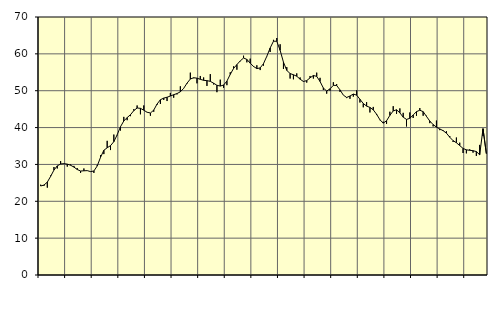
| Category | Piggar | Series 1 |
|---|---|---|
| nan | 24.5 | 24.15 |
| 87.0 | 24.2 | 24.41 |
| 87.0 | 23.7 | 25.2 |
| 87.0 | 27 | 26.77 |
| nan | 29.3 | 28.47 |
| 88.0 | 28.9 | 29.61 |
| 88.0 | 30.9 | 30.12 |
| 88.0 | 30.2 | 30.22 |
| nan | 29.4 | 30.08 |
| 89.0 | 30 | 29.78 |
| 89.0 | 29.6 | 29.28 |
| 89.0 | 29 | 28.62 |
| nan | 27.7 | 28.21 |
| 90.0 | 28.9 | 28.27 |
| 90.0 | 28.3 | 28.32 |
| 90.0 | 28.1 | 28.05 |
| nan | 27.7 | 28.22 |
| 91.0 | 29.8 | 29.57 |
| 91.0 | 32.5 | 31.93 |
| 91.0 | 32.8 | 33.83 |
| nan | 36.4 | 34.52 |
| 92.0 | 33.9 | 35.09 |
| 92.0 | 38.1 | 36.17 |
| 92.0 | 37.9 | 38.03 |
| nan | 39.2 | 40.23 |
| 93.0 | 42.9 | 41.79 |
| 93.0 | 42 | 42.71 |
| 93.0 | 43.1 | 43.48 |
| nan | 45 | 44.59 |
| 94.0 | 46 | 45.31 |
| 94.0 | 43.6 | 45.22 |
| 94.0 | 46 | 44.72 |
| nan | 44.2 | 44.16 |
| 95.0 | 43.2 | 43.96 |
| 95.0 | 44.3 | 44.74 |
| 95.0 | 46.2 | 46.39 |
| nan | 46.4 | 47.55 |
| 96.0 | 47.5 | 48 |
| 96.0 | 47.2 | 48.23 |
| 96.0 | 49.4 | 48.56 |
| nan | 48.1 | 48.92 |
| 97.0 | 49 | 49.23 |
| 97.0 | 51.2 | 49.7 |
| 97.0 | 50.6 | 50.64 |
| nan | 51.9 | 52.04 |
| 98.0 | 54.9 | 53.17 |
| 98.0 | 53.4 | 53.52 |
| 98.0 | 52 | 53.41 |
| nan | 54 | 53.09 |
| 99.0 | 53.6 | 52.82 |
| 99.0 | 51.3 | 52.73 |
| 99.0 | 54.5 | 52.54 |
| nan | 51.7 | 52.04 |
| 0.0 | 49.6 | 51.47 |
| 0.0 | 53 | 51.26 |
| 0.0 | 50.8 | 51.53 |
| nan | 51.5 | 52.61 |
| 1.0 | 55 | 54.43 |
| 1.0 | 56.6 | 56.04 |
| 1.0 | 55.7 | 57.09 |
| nan | 58 | 58.08 |
| 2.0 | 59.5 | 58.87 |
| 2.0 | 57.7 | 58.5 |
| 2.0 | 58.7 | 57.47 |
| nan | 56.7 | 56.59 |
| 3.0 | 56.9 | 56 |
| 3.0 | 55.6 | 56.19 |
| 3.0 | 56.8 | 57.35 |
| nan | 59.4 | 59.34 |
| 4.0 | 60.5 | 61.59 |
| 4.0 | 63.8 | 63.43 |
| 4.0 | 64.3 | 63.42 |
| nan | 62.6 | 60.95 |
| 5.0 | 55.9 | 57.74 |
| 5.0 | 56.4 | 55.51 |
| 5.0 | 53.3 | 54.66 |
| nan | 53.1 | 54.33 |
| 6.0 | 54.7 | 53.93 |
| 6.0 | 53.6 | 53.13 |
| 6.0 | 52.6 | 52.51 |
| nan | 52.2 | 52.74 |
| 7.0 | 54 | 53.5 |
| 7.0 | 53.3 | 54.13 |
| 7.0 | 54.9 | 53.89 |
| nan | 53.5 | 52.51 |
| 8.0 | 50.2 | 50.72 |
| 8.0 | 49.2 | 49.91 |
| 8.0 | 50 | 50.51 |
| nan | 52.3 | 51.46 |
| 9.0 | 51.8 | 51.42 |
| 9.0 | 49.7 | 50.22 |
| 9.0 | 48.8 | 48.81 |
| nan | 48 | 48.17 |
| 10.0 | 47.8 | 48.56 |
| 10.0 | 48.4 | 49.1 |
| 10.0 | 50.1 | 48.8 |
| nan | 46.8 | 47.68 |
| 11.0 | 45.5 | 46.52 |
| 11.0 | 46.9 | 45.83 |
| 11.0 | 44.1 | 45.47 |
| nan | 45.6 | 44.81 |
| 12.0 | 43.4 | 43.62 |
| 12.0 | 42 | 42.13 |
| 12.0 | 41.6 | 41.2 |
| nan | 41 | 41.84 |
| 13.0 | 44.3 | 43.31 |
| 13.0 | 45.8 | 44.52 |
| 13.0 | 43.7 | 44.83 |
| nan | 45.2 | 44 |
| 14.0 | 44 | 42.82 |
| 14.0 | 40.3 | 42.21 |
| 14.0 | 44.1 | 42.51 |
| nan | 42.6 | 43.42 |
| 15.0 | 43.2 | 44.32 |
| 15.0 | 45.3 | 44.71 |
| 15.0 | 43.2 | 44.32 |
| nan | 43.2 | 43.03 |
| 16.0 | 41.2 | 41.77 |
| 16.0 | 40.3 | 40.82 |
| 16.0 | 41.9 | 40.12 |
| nan | 39.3 | 39.63 |
| 17.0 | 39.3 | 39.16 |
| 17.0 | 39 | 38.49 |
| 17.0 | 37.7 | 37.38 |
| nan | 36.1 | 36.45 |
| 18.0 | 37.3 | 35.89 |
| 18.0 | 35.9 | 35.12 |
| 18.0 | 33.1 | 34.34 |
| nan | 33 | 33.96 |
| 19.0 | 34.1 | 33.83 |
| 19.0 | 33.2 | 33.73 |
| 19.0 | 32.3 | 33.49 |
| nan | 35.3 | 32.61 |
| 20.0 | 37.7 | 39.69 |
| 20.0 | 32.9 | 32.96 |